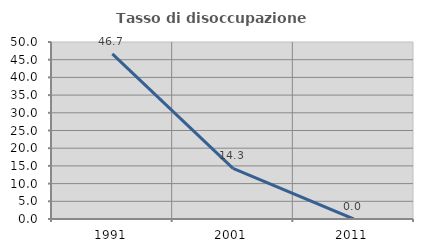
| Category | Tasso di disoccupazione giovanile  |
|---|---|
| 1991.0 | 46.667 |
| 2001.0 | 14.286 |
| 2011.0 | 0 |